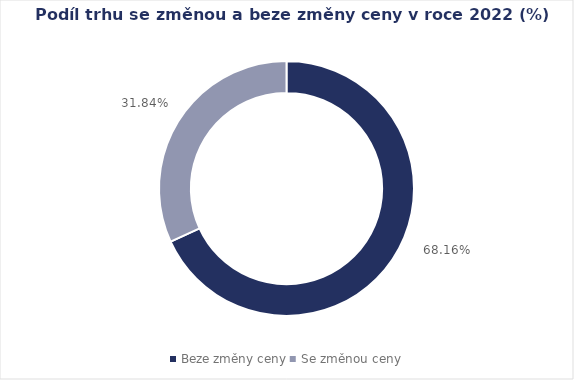
| Category | Series 0 |
|---|---|
| Beze změny ceny | 0.682 |
| Se změnou ceny | 0.318 |